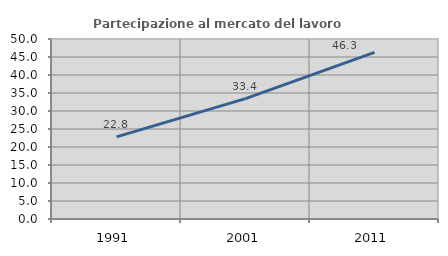
| Category | Partecipazione al mercato del lavoro  femminile |
|---|---|
| 1991.0 | 22.801 |
| 2001.0 | 33.444 |
| 2011.0 | 46.278 |